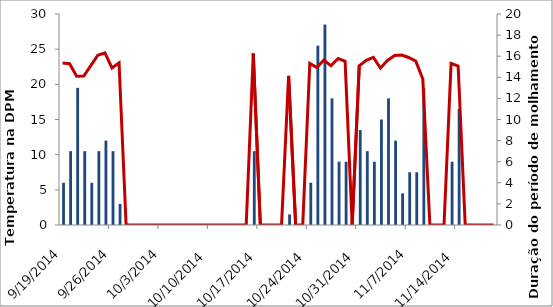
| Category | Series 1 |
|---|---|
| 9/19/14 | 4 |
| 9/20/14 | 7 |
| 9/21/14 | 13 |
| 9/22/14 | 7 |
| 9/23/14 | 4 |
| 9/24/14 | 7 |
| 9/25/14 | 8 |
| 9/26/14 | 7 |
| 9/27/14 | 2 |
| 9/28/14 | 0 |
| 9/29/14 | 0 |
| 9/30/14 | 0 |
| 10/1/14 | 0 |
| 10/2/14 | 0 |
| 10/3/14 | 0 |
| 10/4/14 | 0 |
| 10/5/14 | 0 |
| 10/6/14 | 0 |
| 10/7/14 | 0 |
| 10/8/14 | 0 |
| 10/9/14 | 0 |
| 10/10/14 | 0 |
| 10/11/14 | 0 |
| 10/12/14 | 0 |
| 10/13/14 | 0 |
| 10/14/14 | 0 |
| 10/15/14 | 0 |
| 10/16/14 | 7 |
| 10/17/14 | 0 |
| 10/18/14 | 0 |
| 10/19/14 | 0 |
| 10/20/14 | 0 |
| 10/21/14 | 1 |
| 10/22/14 | 0 |
| 10/23/14 | 0 |
| 10/24/14 | 4 |
| 10/25/14 | 17 |
| 10/26/14 | 19 |
| 10/27/14 | 12 |
| 10/28/14 | 6 |
| 10/29/14 | 6 |
| 10/30/14 | 0 |
| 10/31/14 | 9 |
| 11/1/14 | 7 |
| 11/2/14 | 6 |
| 11/3/14 | 10 |
| 11/4/14 | 12 |
| 11/5/14 | 8 |
| 11/6/14 | 3 |
| 11/7/14 | 5 |
| 11/8/14 | 5 |
| 11/9/14 | 13 |
| 11/10/14 | 0 |
| 11/11/14 | 0 |
| 11/12/14 | 0 |
| 11/13/14 | 6 |
| 11/14/14 | 11 |
| 11/15/14 | 0 |
| 11/16/14 | 0 |
| 11/17/14 | 0 |
| 11/18/14 | 0 |
| 11/19/14 | 0 |